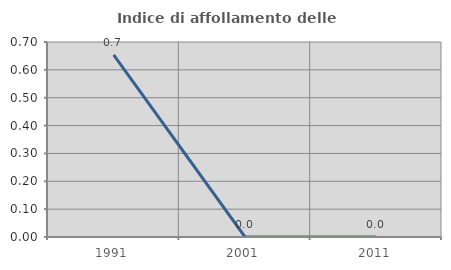
| Category | Indice di affollamento delle abitazioni  |
|---|---|
| 1991.0 | 0.654 |
| 2001.0 | 0 |
| 2011.0 | 0 |